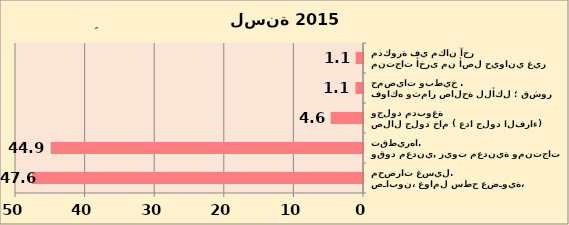
| Category | أهم البضائع للصادرات السلعية الاخرى لسنة 2015 |
|---|---|
| صـابون، عوامل سطح عضـوية، محضرات غسيل. | 47.561 |
| وقود معدني, زيوت معدنية ومنتجات تقطيرها. | 44.868 |
| صلال جلود خام ( عدا جلود الفراء) وجلود مدبوغة | 4.642 |
| فواكه وثمار صالحة للأكل ؛ قشور حمضيات وبطيخ . | 1.094 |
| منتجات أخرى من أصل حيواني غير مذكورة في مكان آخر | 1.058 |